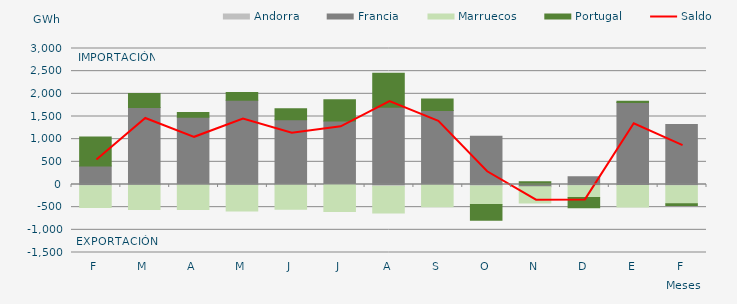
| Category | Andorra | Francia | Marruecos | Portugal |
|---|---|---|---|---|
| F | -24.87 | 405.616 | -479.808 | 640.195 |
| M | -17.673 | 1700.028 | -532.831 | 307.556 |
| A | -12.571 | 1481.456 | -537.409 | 109.483 |
| M | -14.197 | 1856.047 | -569.378 | 172.515 |
| J | -11.779 | 1430.872 | -533.002 | 242.768 |
| J | -0.418 | 1401.028 | -595.551 | 468.384 |
| A | -36.588 | 1705.111 | -590.086 | 749.475 |
| S | -9.723 | 1633.864 | -483.149 | 252.316 |
| O | -30.452 | 1066.176 | -409.55 | -345.946 |
| N | -15.909 | -35.223 | -355.985 | 60.845 |
| D | -27.709 | 172.492 | -261.638 | -222.65 |
| E | -24.796 | 1810.618 | -470.016 | 24.492 |
| F | -26.094 | 1323.107 | -398.465 | -40.33 |